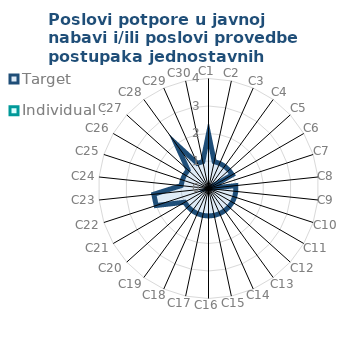
| Category | Target | Individual 1 |
|---|---|---|
| C1 | 2 | 0 |
| C2 | 1 | 0 |
| C3 | 1 | 0 |
| C4 | 1 | 0 |
| C5 | 1 | 0 |
| C6 | 1 | 0 |
| C7 | 0 | 0 |
| C8 | 1 | 0 |
| C9 | 1 | 0 |
| C10 | 1 | 0 |
| C11 | 1 | 0 |
| C12 | 1 | 0 |
| C13 | 1 | 0 |
| C14 | 1 | 0 |
| C15 | 1 | 0 |
| C16 | 1 | 0 |
| C17 | 1 | 0 |
| C18 | 1 | 0 |
| C19 | 1 | 0 |
| C20 | 1 | 0 |
| C21 | 1 | 0 |
| C22 | 2 | 0 |
| C23 | 2 | 0 |
| C24 | 1 | 0 |
| C25 | 1 | 0 |
| C26 | 1 | 0 |
| C27 | 1 | 0 |
| C28 | 2 | 0 |
| C29 | 1 | 0 |
| C30 | 1 | 0 |